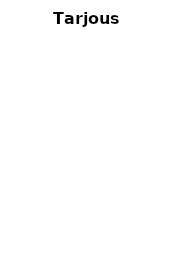
| Category | Tarjous 1 |
|---|---|
| HANKINTAKUSTANNUS KAPPALETTA KOHDEN | 0 |
| KÄYTTÖKUSTANNUSTEN NYKYARVO  | 0 |
| HUOLTOKUSTANNUSTEN NYKYARVO | 0 |
| MUUT KULUT YHTEENSÄ KAPPALETTA KOHDEN, NYKYARVO | 0 |